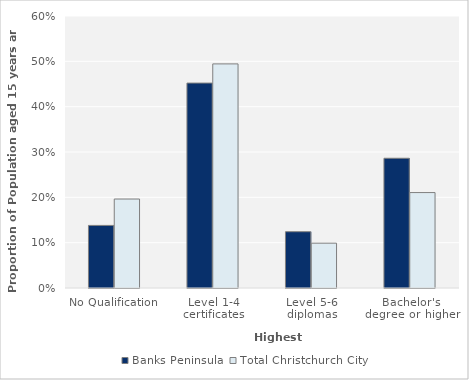
| Category | Banks Peninsula | Total Christchurch City |
|---|---|---|
| No Qualification | 0.138 | 0.196 |
| Level 1-4 certificates | 0.452 | 0.494 |
| Level 5-6 diplomas | 0.124 | 0.099 |
| Bachelor's degree or higher | 0.286 | 0.211 |